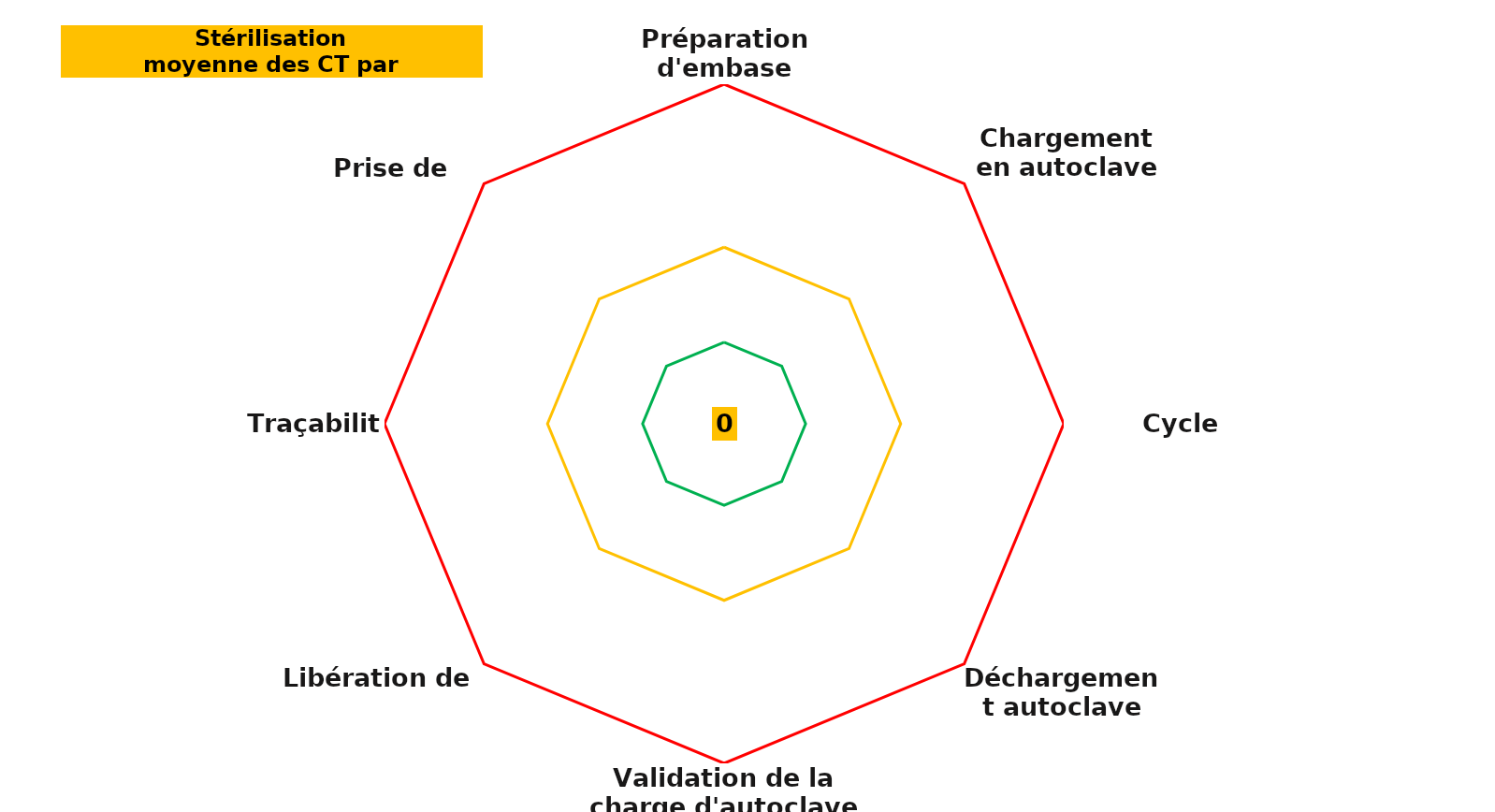
| Category | Series 0 | Series 1 | Series 2 | Series 3 |
|---|---|---|---|---|
| Préparation d'embase d'autoclave | 0 | 6 | 13 | 25 |
| Chargement en autoclave | 0 | 6 | 13 | 25 |
| Cycle d'autoclave | 0 | 6 | 13 | 25 |
| Déchargement autoclave | 0 | 6 | 13 | 25 |
| Validation de la charge d'autoclave | 0 | 6 | 13 | 25 |
| Libération de lot | 0 | 6 | 13 | 25 |
| Traçabilité | 0 | 6 | 13 | 25 |
| Prise de poste | 0 | 6 | 13 | 25 |